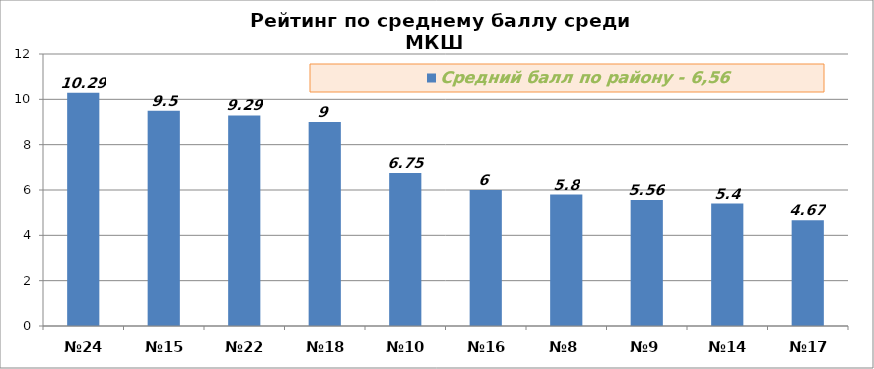
| Category | Средний балл по району - 6,56 |
|---|---|
| №24 | 10.29 |
| №15 | 9.5 |
| №22 | 9.29 |
| №18 | 9 |
| №10 | 6.75 |
| №16 | 6 |
| №8 | 5.8 |
| №9 | 5.56 |
| №14 | 5.4 |
| №17 | 4.67 |